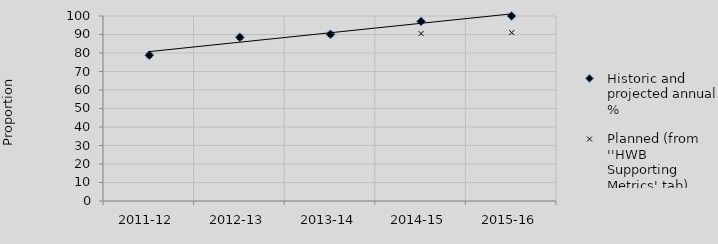
| Category | Historic and projected annual % | Planned (from ''HWB Supporting Metrics' tab) |
|---|---|---|
| 2011-12 | 78.8 | 78.8 |
| 2012-13 | 88.5 | 88.5 |
| 2013-14 | 90.1 | 90.1 |
| 2014-15 | 97.1 | 90.5 |
| 2015-16 | 100 | 91 |